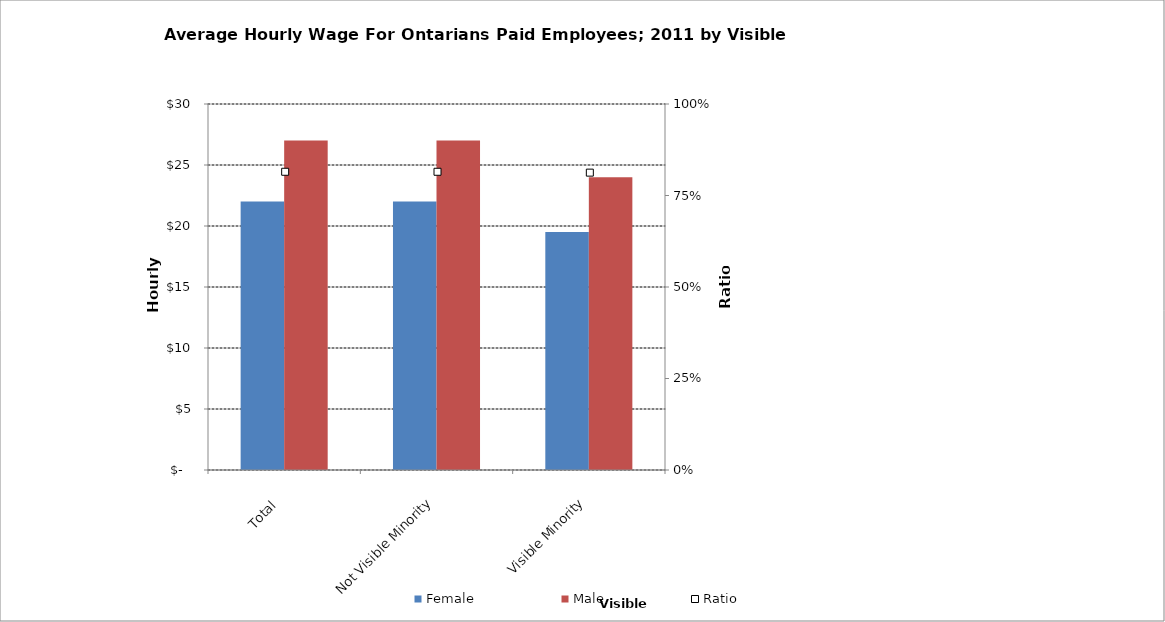
| Category | Female | Male |
|---|---|---|
| Total | 22 | 27 |
|  Not Visible Minority  | 22 | 27 |
|  Visible Minority  | 19.5 | 24 |